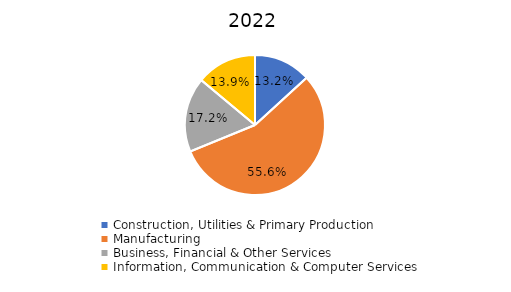
| Category | Series 0 |
|---|---|
| Construction, Utilities & Primary Production  | 0.132 |
| Manufacturing  | 0.556 |
| Business, Financial & Other Services | 0.172 |
| Information, Communication & Computer Services | 0.139 |